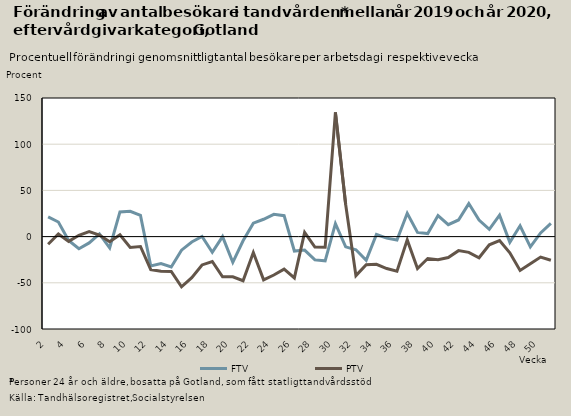
| Category | FTV | PTV |
|---|---|---|
| 2.0 | 21.377 | -8.321 |
| 3.0 | 15.789 | 2.821 |
| 4.0 | -4.134 | -5.199 |
| 5.0 | -13.086 | 1.435 |
| 6.0 | -6.824 | 5.391 |
| 7.0 | 2.899 | 1.662 |
| 8.0 | -12.234 | -5.472 |
| 9.0 | 26.703 | 1.89 |
| 10.0 | 27.318 | -11.818 |
| 11.0 | 22.967 | -10.69 |
| 12.0 | -31.695 | -35.714 |
| 13.0 | -29.126 | -37.415 |
| 14.0 | -32.831 | -37.803 |
| 15.0 | -14.674 | -54.307 |
| 16.0 | -5.801 | -44.402 |
| 17.0 | 0.108 | -30.677 |
| 18.0 | -16.995 | -26.955 |
| 19.0 | 0 | -43.557 |
| 20.0 | -27.801 | -43.575 |
| 21.0 | -4.478 | -47.804 |
| 22.0 | 14.54 | -17.19 |
| 23.0 | 18.78 | -46.818 |
| 24.0 | 24.041 | -41.584 |
| 25.0 | 22.615 | -35.233 |
| 26.0 | -15.617 | -44.694 |
| 27.0 | -14.607 | 4.478 |
| 28.0 | -25.228 | -11.268 |
| 29.0 | -26.255 | -11.594 |
| 30.0 | 13.99 | 134.483 |
| 31.0 | -11.111 | 34.783 |
| 32.0 | -14.286 | -42.238 |
| 33.0 | -25.602 | -30.366 |
| 34.0 | 2.279 | -29.984 |
| 35.0 | -1.63 | -34.594 |
| 36.0 | -3.75 | -37.404 |
| 37.0 | 25.187 | -3.566 |
| 38.0 | 4.481 | -34.492 |
| 39.0 | 3.299 | -23.715 |
| 40.0 | 22.738 | -25.07 |
| 41.0 | 12.854 | -22.67 |
| 42.0 | 18 | -15.192 |
| 43.0 | 35.735 | -17.034 |
| 44.0 | 17.848 | -22.926 |
| 45.0 | 7.822 | -8.903 |
| 46.0 | 23.133 | -4.34 |
| 47.0 | -6.219 | -17.53 |
| 48.0 | 11.659 | -36.589 |
| 49.0 | -11.089 | -29.358 |
| 50.0 | 3.98 | -22.161 |
| 51.0 | 14.286 | -25.608 |